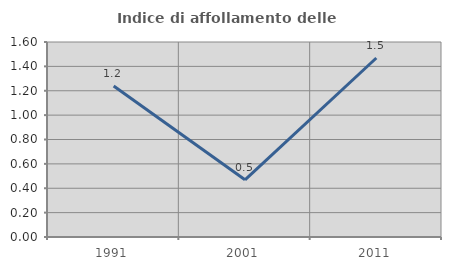
| Category | Indice di affollamento delle abitazioni  |
|---|---|
| 1991.0 | 1.239 |
| 2001.0 | 0.469 |
| 2011.0 | 1.469 |